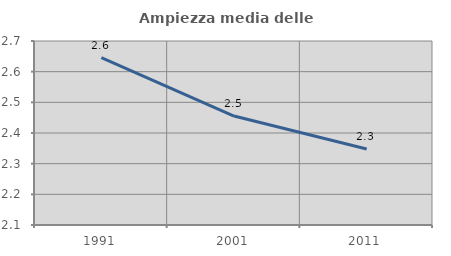
| Category | Ampiezza media delle famiglie |
|---|---|
| 1991.0 | 2.646 |
| 2001.0 | 2.455 |
| 2011.0 | 2.348 |